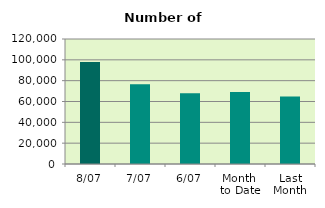
| Category | Series 0 |
|---|---|
| 8/07 | 97872 |
| 7/07 | 76626 |
| 6/07 | 67920 |
| Month 
to Date | 69162.667 |
| Last
Month | 64737.364 |